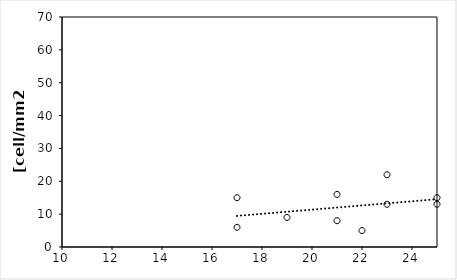
| Category | Middle |
|---|---|
| 17.0 | 15 |
| 17.0 | 6 |
| 23.0 | 13 |
| 23.0 | 22 |
| 21.0 | 16 |
| 21.0 | 8 |
| 19.0 | 9 |
| 22.0 | 5 |
| 25.0 | 15 |
| 25.0 | 13 |